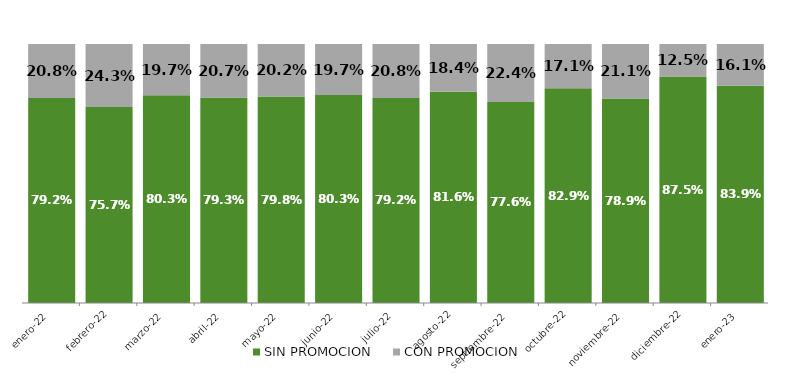
| Category | SIN PROMOCION   | CON PROMOCION   |
|---|---|---|
| 2022-01-01 | 0.792 | 0.208 |
| 2022-02-01 | 0.757 | 0.243 |
| 2022-03-01 | 0.803 | 0.197 |
| 2022-04-01 | 0.793 | 0.207 |
| 2022-05-01 | 0.798 | 0.202 |
| 2022-06-01 | 0.803 | 0.197 |
| 2022-07-01 | 0.792 | 0.208 |
| 2022-08-01 | 0.816 | 0.184 |
| 2022-09-01 | 0.776 | 0.224 |
| 2022-10-01 | 0.829 | 0.171 |
| 2022-11-01 | 0.789 | 0.211 |
| 2022-12-01 | 0.875 | 0.125 |
| 2023-01-01 | 0.839 | 0.161 |